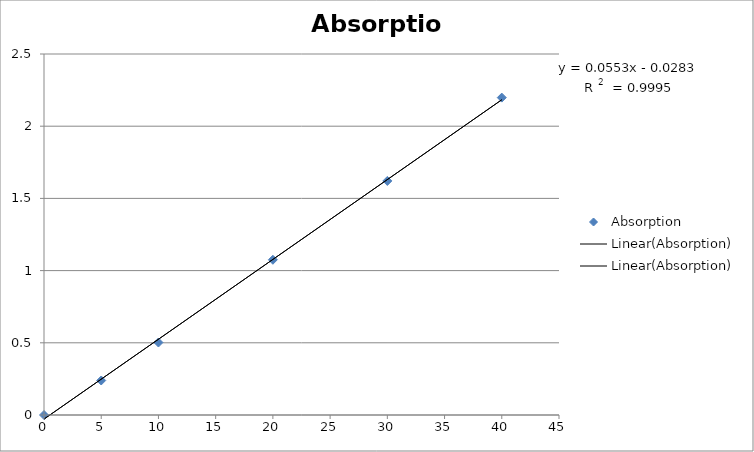
| Category | Absorption |
|---|---|
| 0.0 | 0 |
| 5.0 | 0.239 |
| 10.0 | 0.502 |
| 20.0 | 1.075 |
| 30.0 | 1.621 |
| 40.0 | 2.198 |